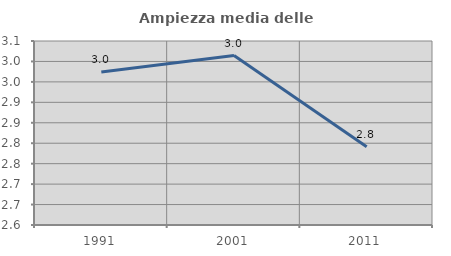
| Category | Ampiezza media delle famiglie |
|---|---|
| 1991.0 | 2.974 |
| 2001.0 | 3.014 |
| 2011.0 | 2.791 |